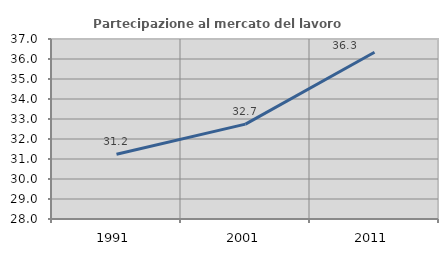
| Category | Partecipazione al mercato del lavoro  femminile |
|---|---|
| 1991.0 | 31.239 |
| 2001.0 | 32.744 |
| 2011.0 | 36.336 |